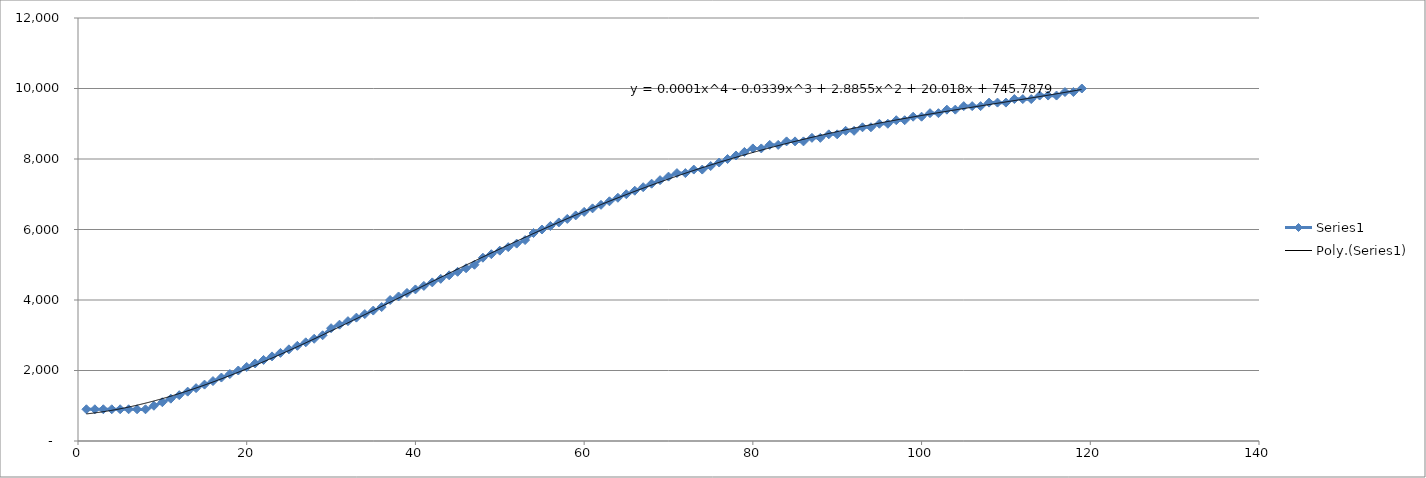
| Category | Series 0 |
|---|---|
| 1.0 | 900 |
| 2.0 | 900 |
| 3.0 | 900 |
| 4.0 | 900 |
| 5.0 | 900 |
| 6.0 | 900 |
| 7.0 | 900 |
| 8.0 | 900 |
| 9.0 | 1000 |
| 10.0 | 1100 |
| 11.0 | 1200 |
| 12.0 | 1300 |
| 13.0 | 1400 |
| 14.0 | 1500 |
| 15.0 | 1600 |
| 16.0 | 1700 |
| 17.0 | 1800 |
| 18.0 | 1900 |
| 19.0 | 2000 |
| 20.0 | 2100 |
| 21.0 | 2200 |
| 22.0 | 2300 |
| 23.0 | 2400 |
| 24.0 | 2500 |
| 25.0 | 2600 |
| 26.0 | 2700 |
| 27.0 | 2800 |
| 28.0 | 2900 |
| 29.0 | 3000 |
| 30.0 | 3200 |
| 31.0 | 3300 |
| 32.0 | 3400 |
| 33.0 | 3500 |
| 34.0 | 3600 |
| 35.0 | 3700 |
| 36.0 | 3800 |
| 37.0 | 4000 |
| 38.0 | 4100 |
| 39.0 | 4200 |
| 40.0 | 4300 |
| 41.0 | 4400 |
| 42.0 | 4500 |
| 43.0 | 4600 |
| 44.0 | 4700 |
| 45.0 | 4800 |
| 46.0 | 4900 |
| 47.0 | 5000 |
| 48.0 | 5200 |
| 49.0 | 5300 |
| 50.0 | 5400 |
| 51.0 | 5500 |
| 52.0 | 5600 |
| 53.0 | 5700 |
| 54.0 | 5900 |
| 55.0 | 6000 |
| 56.0 | 6100 |
| 57.0 | 6200 |
| 58.0 | 6300 |
| 59.0 | 6400 |
| 60.0 | 6500 |
| 61.0 | 6600 |
| 62.0 | 6700 |
| 63.0 | 6800 |
| 64.0 | 6900 |
| 65.0 | 7000 |
| 66.0 | 7100 |
| 67.0 | 7200 |
| 68.0 | 7300 |
| 69.0 | 7400 |
| 70.0 | 7500 |
| 71.0 | 7600 |
| 72.0 | 7600 |
| 73.0 | 7700 |
| 74.0 | 7700 |
| 75.0 | 7800 |
| 76.0 | 7900 |
| 77.0 | 8000 |
| 78.0 | 8100 |
| 79.0 | 8200 |
| 80.0 | 8300 |
| 81.0 | 8300 |
| 82.0 | 8400 |
| 83.0 | 8400 |
| 84.0 | 8500 |
| 85.0 | 8500 |
| 86.0 | 8500 |
| 87.0 | 8600 |
| 88.0 | 8600 |
| 89.0 | 8700 |
| 90.0 | 8700 |
| 91.0 | 8800 |
| 92.0 | 8800 |
| 93.0 | 8900 |
| 94.0 | 8900 |
| 95.0 | 9000 |
| 96.0 | 9000 |
| 97.0 | 9100 |
| 98.0 | 9100 |
| 99.0 | 9200 |
| 100.0 | 9200 |
| 101.0 | 9300 |
| 102.0 | 9300 |
| 103.0 | 9400 |
| 104.0 | 9400 |
| 105.0 | 9500 |
| 106.0 | 9500 |
| 107.0 | 9500 |
| 108.0 | 9600 |
| 109.0 | 9600 |
| 110.0 | 9600 |
| 111.0 | 9700 |
| 112.0 | 9700 |
| 113.0 | 9700 |
| 114.0 | 9800 |
| 115.0 | 9800 |
| 116.0 | 9800 |
| 117.0 | 9900 |
| 118.0 | 9900 |
| 119.0 | 10000 |